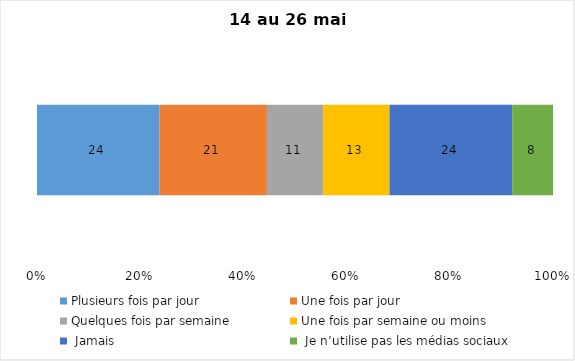
| Category | Plusieurs fois par jour | Une fois par jour | Quelques fois par semaine   | Une fois par semaine ou moins   |  Jamais   |  Je n’utilise pas les médias sociaux |
|---|---|---|---|---|---|---|
| 0 | 24 | 21 | 11 | 13 | 24 | 8 |